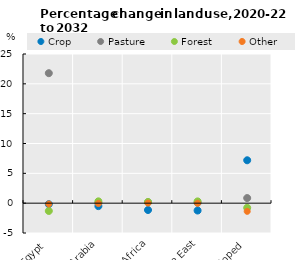
| Category | Crop | Pasture | Forest | Other |
|---|---|---|---|---|
| Egypt | -0.171 | 21.783 | -1.304 | -0.135 |
| Saudi Arabia | -0.497 | 0.008 | 0.306 | -0.032 |
| North Africa | -1.146 | 0.145 | 0.201 | 0.02 |
| Middle East | -1.234 | 0.055 | 0.296 | -0.012 |
| Least Developed | 7.188 | 0.855 | -0.77 | -1.37 |